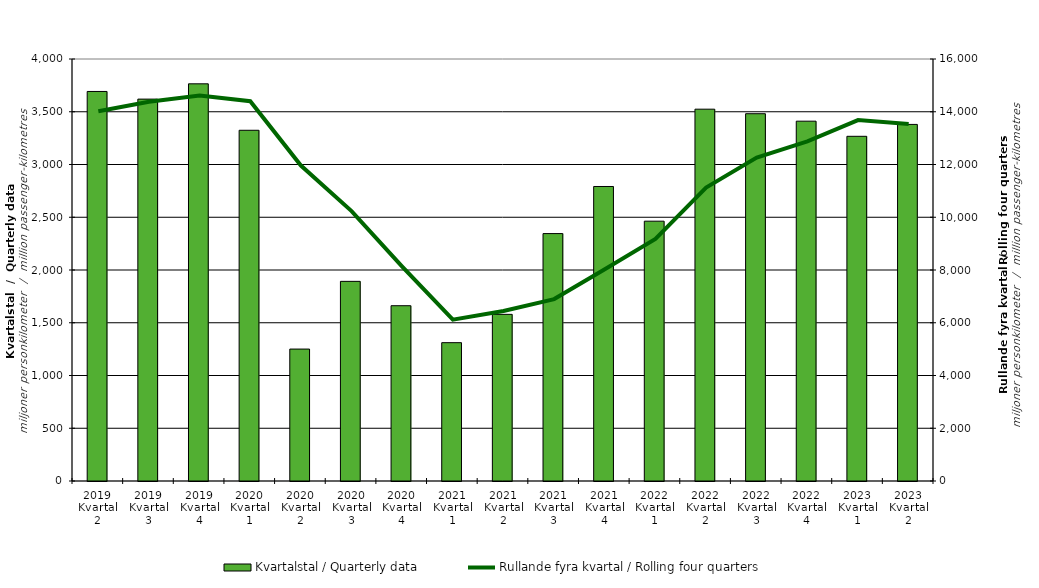
| Category | Kvartalstal / Quarterly data |
|---|---|
| 2019 Kvartal 2 | 3692.248 |
| 2019 Kvartal 3 | 3619.721 |
| 2019 Kvartal 4 | 3764.759 |
| 2020 Kvartal 1 | 3324.383 |
| 2020 Kvartal 2 | 1250.488 |
| 2020 Kvartal 3 | 1892.351 |
| 2020 Kvartal 4 | 1661.523 |
| 2021 Kvartal 1 | 1311.197 |
| 2021 Kvartal 2 | 1579.614 |
| 2021 Kvartal 3 | 2345.169 |
| 2021 Kvartal 4 | 2791.509 |
| 2022 Kvartal 1 | 2462.735 |
| 2022 Kvartal 2 | 3524.434 |
| 2022 Kvartal 3 | 3481.38 |
| 2022 Kvartal 4 | 3410.614 |
| 2023 Kvartal 1 | 3267.284 |
| 2023 Kvartal 2 | 3379.95 |